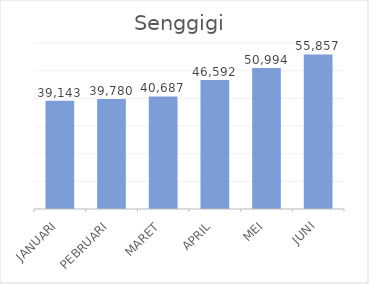
| Category |  39,143  |
|---|---|
| JANUARI | 39143 |
| PEBRUARI | 39780 |
| MARET | 40687 |
| APRIL | 46592 |
| MEI | 50994 |
| JUNI | 55857 |